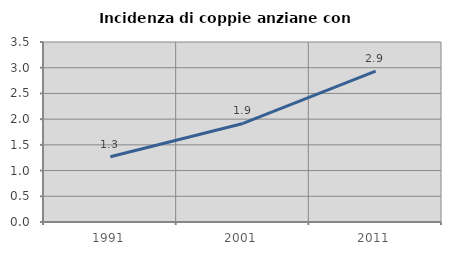
| Category | Incidenza di coppie anziane con figli |
|---|---|
| 1991.0 | 1.269 |
| 2001.0 | 1.916 |
| 2011.0 | 2.933 |